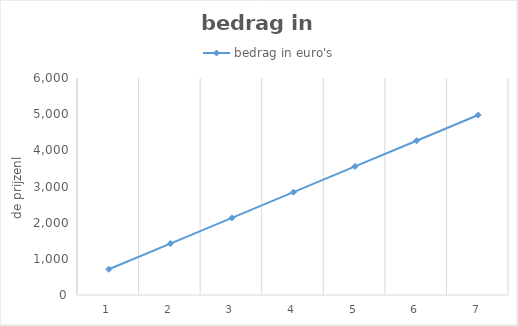
| Category | bedrag in euro's |
|---|---|
| 0 | 711 |
| 1 | 1422 |
| 2 | 2133 |
| 3 | 2844 |
| 4 | 3555 |
| 5 | 4266 |
| 6 | 4977 |